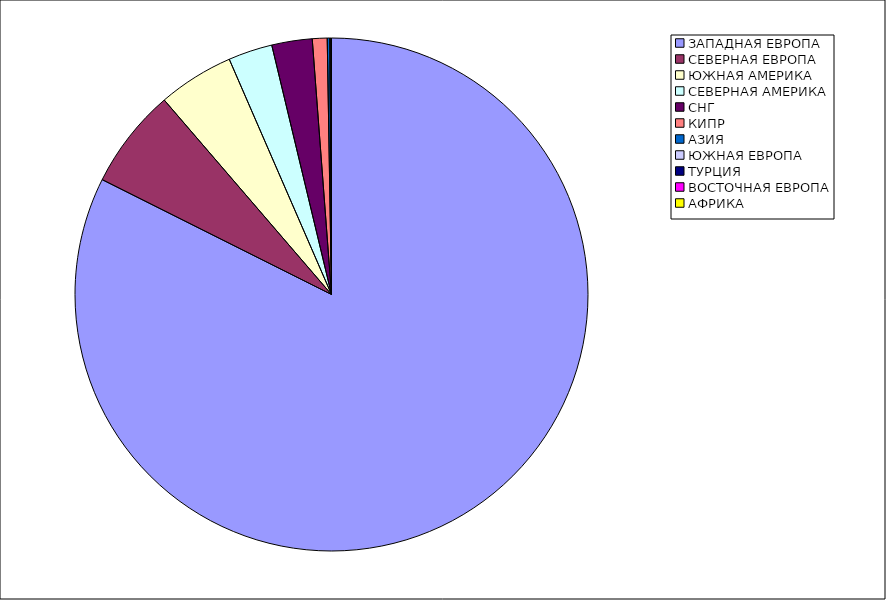
| Category | Оборот |
|---|---|
| ЗАПАДНАЯ ЕВРОПА | 0.824 |
| СЕВЕРНАЯ ЕВРОПА | 0.063 |
| ЮЖНАЯ АМЕРИКА | 0.048 |
| СЕВЕРНАЯ АМЕРИКА | 0.028 |
| СНГ | 0.025 |
| КИПР | 0.009 |
| АЗИЯ | 0.002 |
| ЮЖНАЯ ЕВРОПА | 0.001 |
| ТУРЦИЯ | 0 |
| ВОСТОЧНАЯ ЕВРОПА | 0 |
| АФРИКА | 0 |